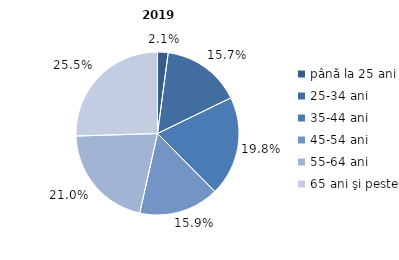
| Category | Series 0 |
|---|---|
| până la 25 ani | 2.1 |
| 25-34 ani | 15.7 |
| 35-44 ani | 19.8 |
| 45-54 ani | 15.9 |
| 55-64 ani | 21 |
| 65 ani şi peste | 25.5 |